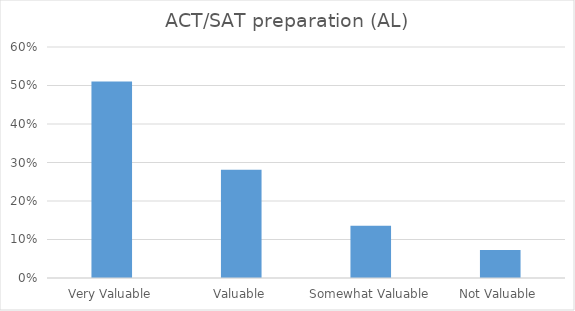
| Category | ACT/SAT preparation (AL) |
|---|---|
| Very Valuable | 0.51 |
| Valuable | 0.281 |
| Somewhat Valuable | 0.135 |
| Not Valuable | 0.073 |